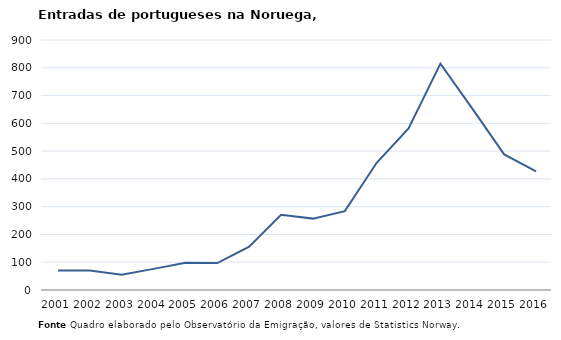
| Category | Entradas |
|---|---|
| 2001.0 | 70 |
| 2002.0 | 70 |
| 2003.0 | 55 |
| 2004.0 | 76 |
| 2005.0 | 98 |
| 2006.0 | 97 |
| 2007.0 | 156 |
| 2008.0 | 271 |
| 2009.0 | 257 |
| 2010.0 | 284 |
| 2011.0 | 458 |
| 2012.0 | 582 |
| 2013.0 | 815 |
| 2014.0 | 653 |
| 2015.0 | 488 |
| 2016.0 | 427 |